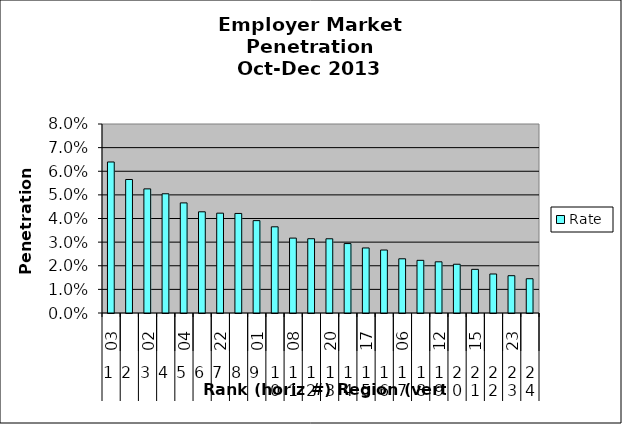
| Category | Rate |
|---|---|
| 0 | 0.064 |
| 1 | 0.057 |
| 2 | 0.053 |
| 3 | 0.05 |
| 4 | 0.047 |
| 5 | 0.043 |
| 6 | 0.042 |
| 7 | 0.042 |
| 8 | 0.039 |
| 9 | 0.036 |
| 10 | 0.032 |
| 11 | 0.031 |
| 12 | 0.031 |
| 13 | 0.029 |
| 14 | 0.028 |
| 15 | 0.027 |
| 16 | 0.023 |
| 17 | 0.022 |
| 18 | 0.022 |
| 19 | 0.021 |
| 20 | 0.018 |
| 21 | 0.017 |
| 22 | 0.016 |
| 23 | 0.015 |